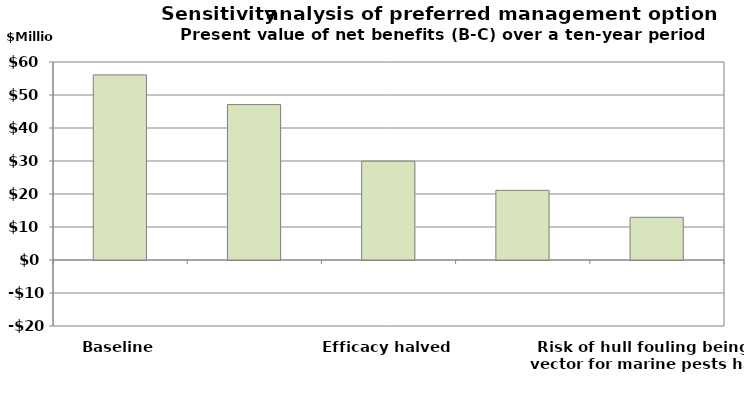
| Category | LOF 2 movement |
|---|---|
| Baseline | 56.094 |
| Private costs twice as high | 47.086 |
| Efficacy halved | 29.959 |
| Value of marine environment (benefit) halved  | 21.111 |
| Risk of hull fouling being the vector for marine pests halved | 12.936 |